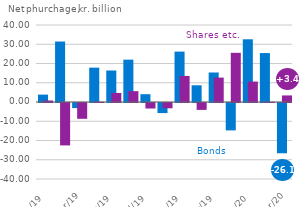
| Category | Bonds | Shares ect.  |
|---|---|---|
| 2019-01-01 | 3.835 | 0.786 |
| 2019-02-01 | 31.408 | -22.038 |
| 2019-03-01 | -2.65 | -8.215 |
| 2019-04-01 | 17.843 | 0.124 |
| 2019-05-01 | 16.369 | 4.692 |
| 2019-06-01 | 22.002 | 5.637 |
| 2019-07-01 | 4.055 | -2.856 |
| 2019-08-01 | -5.233 | -2.746 |
| 2019-09-01 | 26.183 | 13.539 |
| 2019-10-01 | 8.68 | -3.572 |
| 2019-11-01 | 15.325 | 12.685 |
| 2019-12-01 | -14.229 | 25.551 |
| 2020-01-01 | 32.577 | 10.599 |
| 2020-02-01 | 25.416 | 0.076 |
| 2020-03-01 | -26.121 | 3.416 |